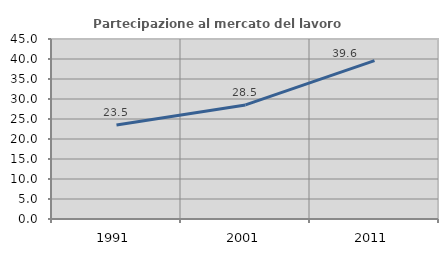
| Category | Partecipazione al mercato del lavoro  femminile |
|---|---|
| 1991.0 | 23.488 |
| 2001.0 | 28.514 |
| 2011.0 | 39.583 |